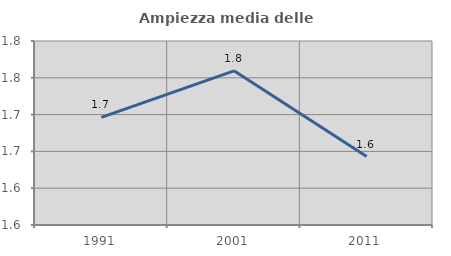
| Category | Ampiezza media delle famiglie |
|---|---|
| 1991.0 | 1.696 |
| 2001.0 | 1.759 |
| 2011.0 | 1.643 |